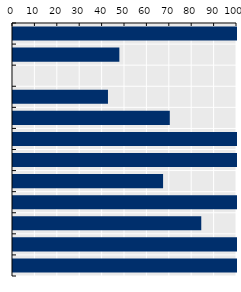
| Category | Payment rate (%) |
|---|---|
| Viet Nam* | 100 |
| New Zealand | 47.485 |
| OECD average | 0 |
| Australia | 42.396 |
| Mongolia* | 70 |
| Singapore* | 100 |
| China | 100 |
| Japan | 67 |
| Indonesia* | 100 |
| Korea | 84.05 |
| Thailand* | 100 |
| Malaysia* | 100 |